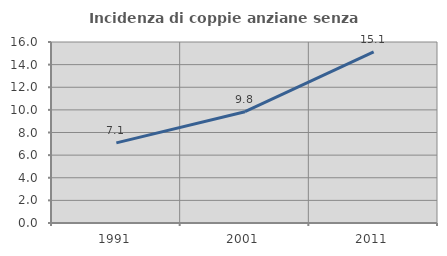
| Category | Incidenza di coppie anziane senza figli  |
|---|---|
| 1991.0 | 7.084 |
| 2001.0 | 9.841 |
| 2011.0 | 15.118 |